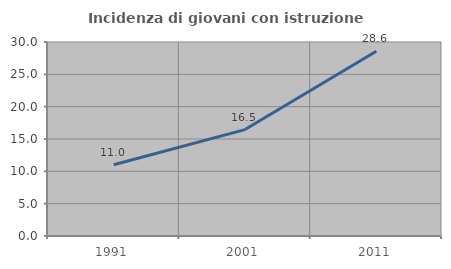
| Category | Incidenza di giovani con istruzione universitaria |
|---|---|
| 1991.0 | 11.024 |
| 2001.0 | 16.456 |
| 2011.0 | 28.571 |